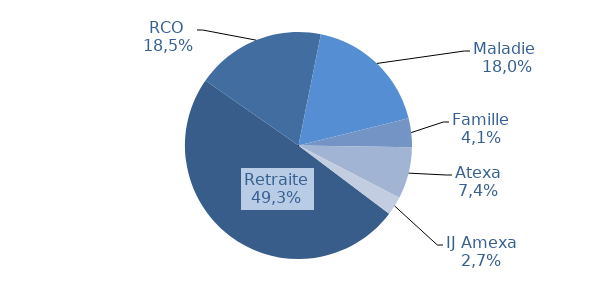
| Category | Series 0 |
|---|---|
| ü retraite | 0.494 |
| ü retraite complémentaire obligatoire | 0.185 |
| ü maladie et invalidité | 0.18 |
| ü famille | 0.041 |
| ü accident du travail et maladie professionnelle | 0.074 |
| ü IJ AMEXA | 0.027 |